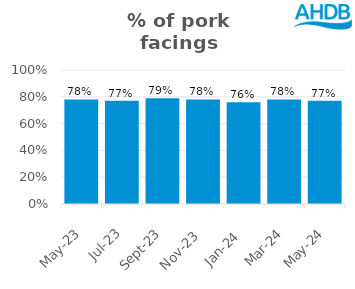
| Category | Pork |
|---|---|
| 2023-05-01 | 0.78 |
| 2023-07-01 | 0.77 |
| 2023-09-01 | 0.79 |
| 2023-11-01 | 0.78 |
| 2024-01-01 | 0.76 |
| 2024-03-01 | 0.78 |
| 2024-05-01 | 0.77 |